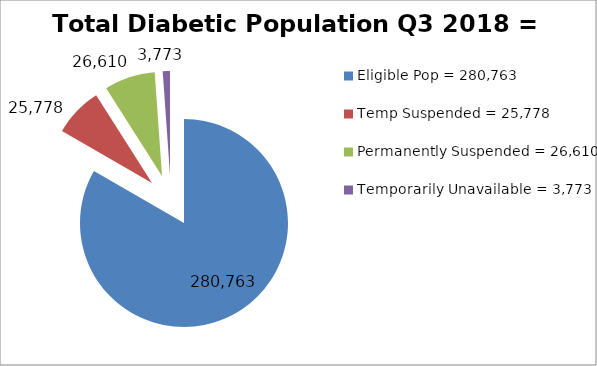
| Category | Total Diabetic Population Q3 2018 = 329,378 |
|---|---|
| Eligible Pop = 280,763 | 280763 |
| Temp Suspended = 25,778 | 25778 |
| Permanently Suspended = 26,610 | 26610 |
| Temporarily Unavailable = 3,773 | 3773 |